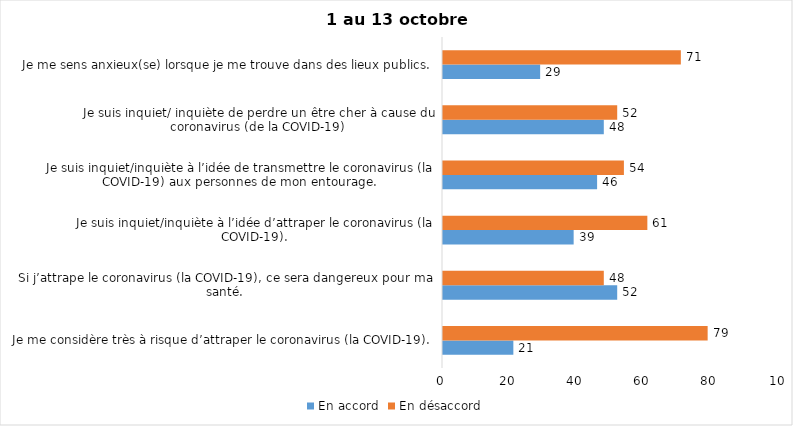
| Category | En accord | En désaccord |
|---|---|---|
| Je me considère très à risque d’attraper le coronavirus (la COVID-19). | 21 | 79 |
| Si j’attrape le coronavirus (la COVID-19), ce sera dangereux pour ma santé. | 52 | 48 |
| Je suis inquiet/inquiète à l’idée d’attraper le coronavirus (la COVID-19). | 39 | 61 |
| Je suis inquiet/inquiète à l’idée de transmettre le coronavirus (la COVID-19) aux personnes de mon entourage. | 46 | 54 |
| Je suis inquiet/ inquiète de perdre un être cher à cause du coronavirus (de la COVID-19) | 48 | 52 |
| Je me sens anxieux(se) lorsque je me trouve dans des lieux publics. | 29 | 71 |